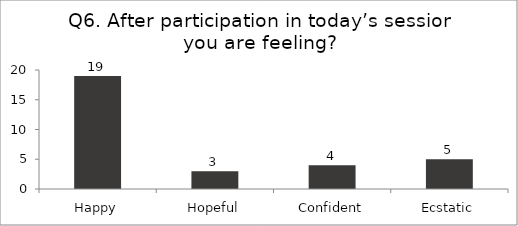
| Category | Q6. After participation in today’s session you are feeling? |
|---|---|
| Happy | 19 |
| Hopeful | 3 |
| Confident | 4 |
| Ecstatic | 5 |